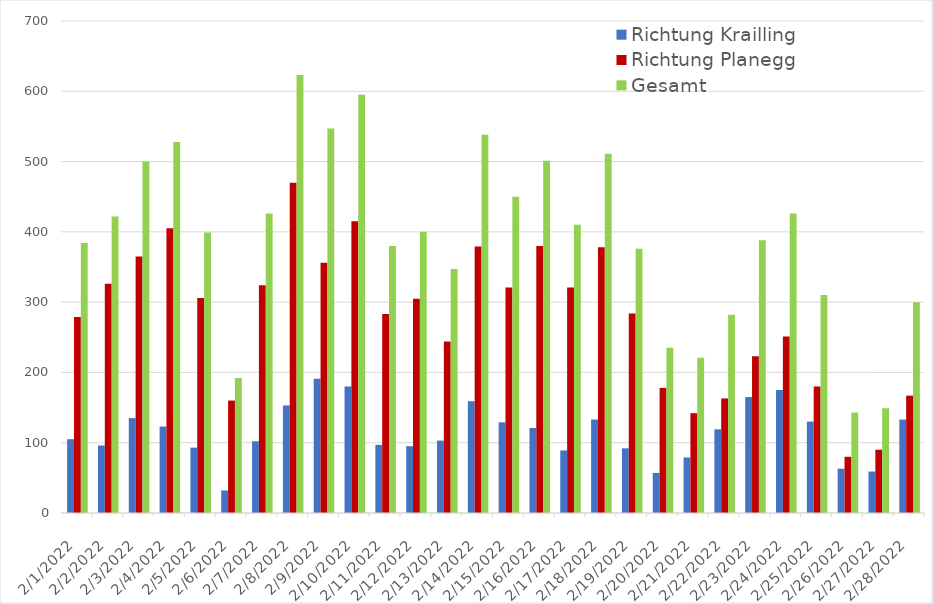
| Category | Richtung Krailling | Richtung Planegg | Gesamt |
|---|---|---|---|
| 2/1/22 | 105 | 279 | 384 |
| 2/2/22 | 96 | 326 | 422 |
| 2/3/22 | 135 | 365 | 500 |
| 2/4/22 | 123 | 405 | 528 |
| 2/5/22 | 93 | 306 | 399 |
| 2/6/22 | 32 | 160 | 192 |
| 2/7/22 | 102 | 324 | 426 |
| 2/8/22 | 153 | 470 | 623 |
| 2/9/22 | 191 | 356 | 547 |
| 2/10/22 | 180 | 415 | 595 |
| 2/11/22 | 97 | 283 | 380 |
| 2/12/22 | 95 | 305 | 400 |
| 2/13/22 | 103 | 244 | 347 |
| 2/14/22 | 159 | 379 | 538 |
| 2/15/22 | 129 | 321 | 450 |
| 2/16/22 | 121 | 380 | 501 |
| 2/17/22 | 89 | 321 | 410 |
| 2/18/22 | 133 | 378 | 511 |
| 2/19/22 | 92 | 284 | 376 |
| 2/20/22 | 57 | 178 | 235 |
| 2/21/22 | 79 | 142 | 221 |
| 2/22/22 | 119 | 163 | 282 |
| 2/23/22 | 165 | 223 | 388 |
| 2/24/22 | 175 | 251 | 426 |
| 2/25/22 | 130 | 180 | 310 |
| 2/26/22 | 63 | 80 | 143 |
| 2/27/22 | 59 | 90 | 149 |
| 2/28/22 | 133 | 167 | 300 |